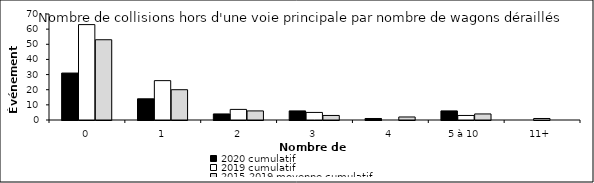
| Category | 2020 cumulatif | 2019 cumulatif | 2015-2019 moyenne cumulatif |
|---|---|---|---|
| 0 | 31 | 63 | 53 |
| 1 | 14 | 26 | 20 |
| 2 | 4 | 7 | 6 |
| 3 | 6 | 5 | 3 |
| 4 | 1 | 0 | 2 |
| 5 à 10 | 6 | 3 | 4 |
| 11+ | 0 | 1 | 0 |